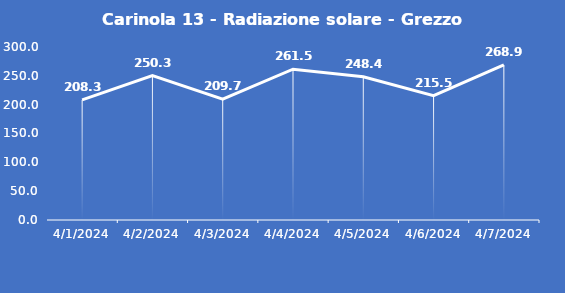
| Category | Carinola 13 - Radiazione solare - Grezzo (W/m2) |
|---|---|
| 4/1/24 | 208.3 |
| 4/2/24 | 250.3 |
| 4/3/24 | 209.7 |
| 4/4/24 | 261.5 |
| 4/5/24 | 248.4 |
| 4/6/24 | 215.5 |
| 4/7/24 | 268.9 |